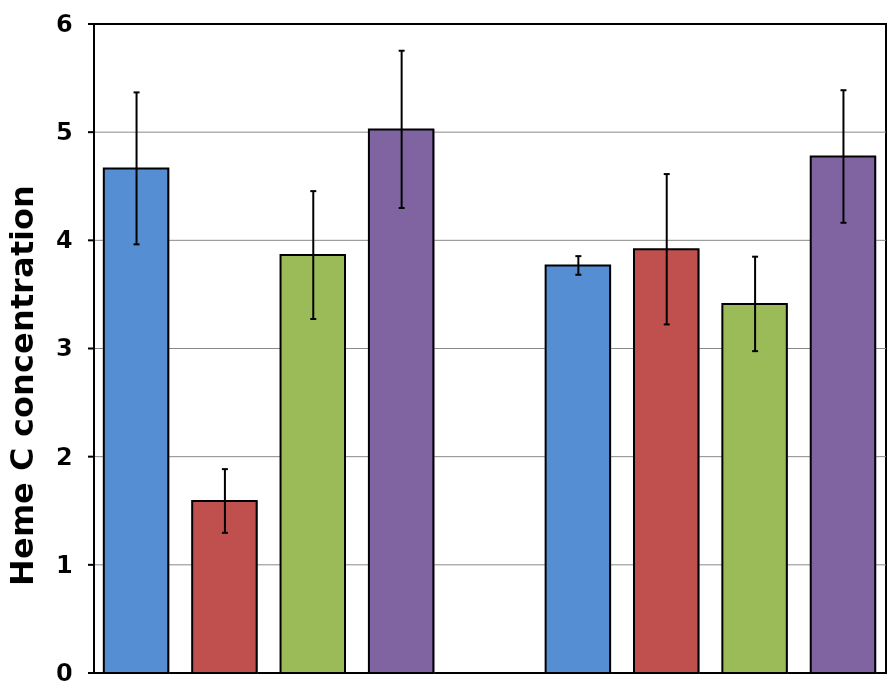
| Category | MR1/ev 4hr | 15/ev 4hr | mr1/ev ALA 4hrs | 15/ev ALA 4hrs | Series 4 | MR1/ev 8hr | 15/ev 8hr | mr1/ev ALA 8hrs | 15/ev ALA 8hrs |
|---|---|---|---|---|---|---|---|---|---|
| 0 | 4.665 | 1.59 | 3.864 | 5.026 |  | 3.768 | 3.917 | 3.412 | 4.775 |